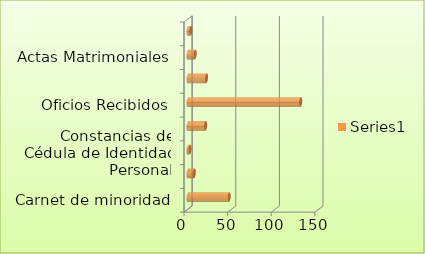
| Category | Series 0 |
|---|---|
| Carnet de minoridad | 47 |
| Constancias de solteria | 7 |
| Constancias de Cédula de Identidad Personal | 2 |
| Constancias varias | 20 |
| Oficios Recibidos | 129 |
| Oficios Despachados | 21 |
| Actas Matrimoniales | 8 |
| Reposicion de Partidas de Nacimiento | 3 |